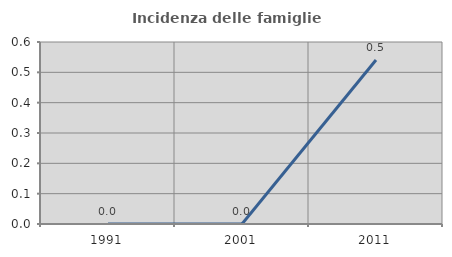
| Category | Incidenza delle famiglie numerose |
|---|---|
| 1991.0 | 0 |
| 2001.0 | 0 |
| 2011.0 | 0.541 |